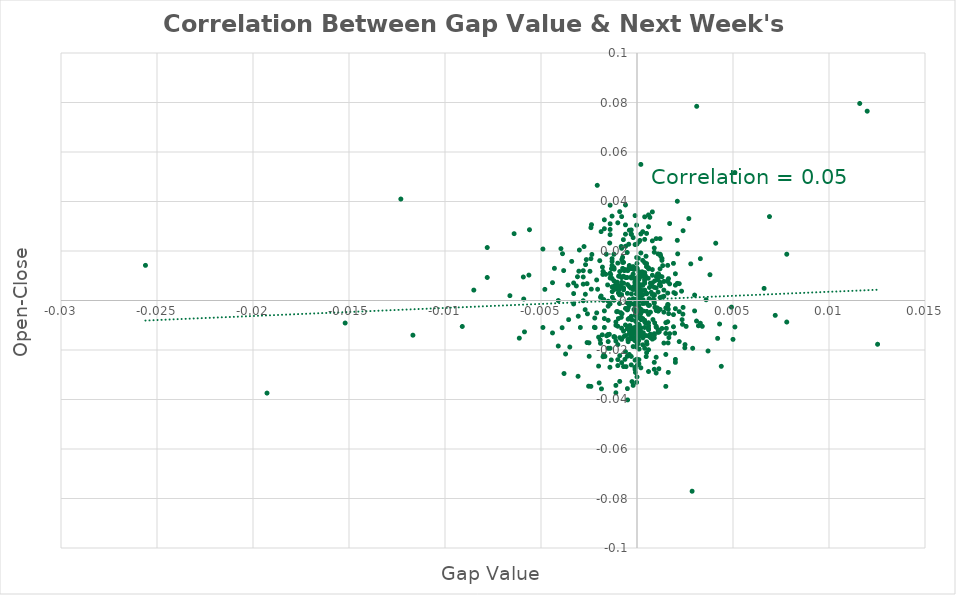
| Category | Series 0 |
|---|---|
| -0.000650000000000039 | 0.012 |
| 0.000739999999999962 | 0.006 |
| 0.000129999999999963 | 0.01 |
| -2.99999999999744e-05 | 0.003 |
| -0.000439999999999995 | -0.01 |
| -0.000589999999999868 | -0.014 |
| -0.00141999999999997 | 0.023 |
| -8.000000000008e-05 | 0 |
| -0.000879999999999991 | 0.002 |
| 0.000900000000000122 | -0.015 |
| 0.000789999999999846 | 0.002 |
| -0.0011899999999998 | 0.013 |
| -0.000460000000000127 | -0.008 |
| 0.00123000000000006 | 0.006 |
| 0.000210000000000043 | -0.008 |
| -0.000600000000000156 | 0.031 |
| -0.000199999999999978 | 0.004 |
| -0.000290000000000123 | 0.003 |
| 0.000140000000000029 | -0.004 |
| 0.000699999999999922 | -0.005 |
| 0.00150000000000005 | -0.009 |
| 1.00000000000655e-05 | -0.018 |
| -0.00101000000000017 | 0.006 |
| -0.000850000000000239 | -0.005 |
| 0.000220000000000109 | -0.013 |
| -0.000480000000000036 | 0.012 |
| -7.00000000000145e-05 | -0.004 |
| -0.00238000000000004 | 0.005 |
| 0.000129999999999963 | 0.006 |
| -0.00221999999999988 | -0.011 |
| 0.00119000000000002 | 0.01 |
| 0.00101000000000017 | 0.01 |
| -0.000390000000000112 | -0.015 |
| -0.00180999999999986 | -0.014 |
| 0.00104000000000015 | -0.003 |
| -9.99999999984346e-06 | -0.001 |
| 0.000920000000000031 | -0.009 |
| 0.000650000000000039 | -0.002 |
| -0.00051000000000001 | 0.009 |
| -0.000340000000000007 | -0.011 |
| -0.0116699999999998 | -0.014 |
| 0.0125299999999999 | -0.018 |
| -0.00235000000000007 | 0.019 |
| 0.00255999999999989 | -0.01 |
| 0.000390000000000112 | -0.001 |
| -0.00218000000000007 | -0.011 |
| 0.00102000000000002 | -0.004 |
| -0.0024900000000001 | -0.023 |
| 0.000299999999999967 | 0.01 |
| -0.00117000000000011 | -0.015 |
| -0.00177000000000004 | 0.012 |
| -0.00038999999999989 | -0.012 |
| 0.00162000000000017 | -0.017 |
| 0.00120999999999993 | 0.019 |
| -0.00143999999999988 | -0.014 |
| -0.00207000000000001 | 0.047 |
| -0.000489999999999879 | 0.006 |
| -0.000569999999999959 | -0.027 |
| 0.000319999999999875 | 0 |
| 0.000929999999999875 | -0.003 |
| -0.000909999999999966 | 0.002 |
| -7.99999999998579e-05 | -0.029 |
| -0.00133999999999989 | -0.024 |
| 0.00117000000000011 | 0.006 |
| -0.00116000000000005 | -0.015 |
| 0.000269999999999992 | -0.014 |
| 0.00016000000000016 | 0.002 |
| -0.00264000000000019 | 0.017 |
| 0.00134000000000011 | 0.014 |
| -0.00251999999999985 | -0.035 |
| 0.000520000000000076 | -0.018 |
| 0.0 | -0.006 |
| -1.99999999999089e-05 | 0.03 |
| -0.00103000000000008 | 0.007 |
| -0.000129999999999963 | -0.013 |
| -0.000310000000000032 | 0.013 |
| 0.00162999999999979 | -0.004 |
| -0.00372000000000016 | -0.022 |
| -0.00193999999999983 | 0.016 |
| 0.00286999999999992 | -0.077 |
| 0.0119899999999999 | 0.077 |
| 0.00310999999999994 | 0.078 |
| -0.00063000000000013 | -0.024 |
| -0.00133000000000005 | 0.013 |
| -0.00120000000000009 | 0.008 |
| 8.99999999999234e-05 | -0.016 |
| -0.00239999999999995 | 0.029 |
| 0.000329999999999941 | -0.013 |
| -0.000970000000000137 | -0.007 |
| -0.00269000000000008 | 0.003 |
| 8.000000000008e-05 | 0.002 |
| 0.00063000000000013 | 0.001 |
| -7.00000000000145e-05 | -0.008 |
| 0.000669999999999948 | 0.034 |
| 0.000110000000000054 | -0.02 |
| -0.00173 | -0.022 |
| 0.00234999999999985 | -0.008 |
| 0.00163999999999986 | 0.009 |
| 0.00153000000000003 | -0.011 |
| -0.000750000000000028 | 0.015 |
| -0.000509999999999788 | -0.011 |
| -0.00381999999999993 | 0.012 |
| -0.00185000000000012 | -0.036 |
| -0.00197000000000002 | -0.033 |
| 0.000329999999999941 | -0.004 |
| -0.000750000000000028 | 0.017 |
| -0.00128000000000017 | 0.001 |
| -0.00167000000000006 | -0.023 |
| -0.00157999999999991 | -0.014 |
| -0.00177999999999989 | 0.011 |
| 0.00116000000000005 | -0.013 |
| 0.00236999999999998 | -0.01 |
| -0.00174999999999991 | 0.011 |
| -0.00059000000000009 | 0.022 |
| -0.00137000000000009 | 0.01 |
| 0.0 | 0.008 |
| 9.00000000001455e-05 | -0.005 |
| 7.00000000000145e-05 | 0.017 |
| -0.00129000000000001 | 0.004 |
| -0.00046999999999997 | -0.016 |
| -0.000399999999999955 | 0.014 |
| 7.00000000000145e-05 | -0.011 |
| 0.00130000000000007 | 0.01 |
| 0.00129000000000001 | 0.001 |
| -0.000399999999999955 | 0.028 |
| -0.00267999999999979 | 0.014 |
| 1.99999999999089e-05 | -0.026 |
| 0.000920000000000031 | 0.008 |
| -7.00000000000145e-05 | 0.009 |
| -0.000159999999999938 | -0.004 |
| 0.000839999999999951 | 0 |
| 0.00046999999999997 | 0.018 |
| 0.00059000000000009 | 0.009 |
| -0.0030699999999999 | -0.031 |
| 0.00409999999999999 | 0.023 |
| 0.00195999999999996 | -0.013 |
| 0.00165999999999999 | -0.015 |
| -0.000329999999999941 | 0.005 |
| -0.000750000000000028 | 0.013 |
| -0.00162999999999979 | 0.011 |
| -2.0000000000131e-05 | -0.033 |
| 0.00161999999999995 | -0.002 |
| 1.00000000000655e-05 | -0.011 |
| -0.000460000000000127 | -0.003 |
| 0.00164999999999992 | -0.005 |
| 0.00158999999999998 | -0.003 |
| -0.00302999999999986 | 0.012 |
| 0.00192000000000014 | 0.003 |
| 0.00121999999999999 | 0.007 |
| 0.00231999999999987 | 0.004 |
| -0.00592000000000014 | 0.009 |
| 0.00661999999999984 | 0.005 |
| 6.0000000000171e-05 | -0.013 |
| 0.000149999999999872 | 0.024 |
| -0.00662000000000007 | 0.002 |
| 0.000189999999999912 | -0.003 |
| 0.000829999999999886 | -0.008 |
| -0.000950000000000006 | 0.004 |
| -0.000199999999999978 | -0.001 |
| 0.000310000000000032 | -0.015 |
| -0.00409999999999999 | 0 |
| -0.000240000000000018 | -0.011 |
| -0.000369999999999981 | -0.01 |
| -0.00173 | 0 |
| -0.00042999999999993 | 0.023 |
| 0.00107000000000012 | 0.011 |
| -0.00081999999999982 | 0.002 |
| -0.000959999999999849 | 0.01 |
| 0.00209999999999999 | 0.007 |
| -0.00294999999999978 | -0.011 |
| -0.00117999999999995 | 0.004 |
| -0.00175000000000014 | 0 |
| -0.000159999999999938 | 0.013 |
| -0.000820000000000042 | -0.007 |
| 0.002 | -0.003 |
| -0.000790000000000068 | 0.017 |
| 2.99999999999744e-05 | 0.007 |
| 0.000890000000000057 | -0.001 |
| -0.000709999999999988 | 0.025 |
| -0.000820000000000042 | 0.022 |
| 9.99999999999889e-05 | 0.024 |
| -0.000450000000000061 | -0.016 |
| 3.99999999998179e-05 | -0.007 |
| 0.000269999999999992 | 0.012 |
| -2.99999999999744e-05 | -0.019 |
| 0.000450000000000061 | -0.009 |
| -0.000780000000000002 | -0.005 |
| 0.00212000000000012 | 0.019 |
| -0.0020500000000001 | 0.005 |
| -0.00177000000000004 | -0.023 |
| -0.00187000000000026 | 0.028 |
| -0.00186999999999981 | 0.002 |
| 0.00439000000000011 | -0.027 |
| 0.000179999999999846 | -0.012 |
| -0.000459999999999904 | -0.017 |
| -0.00106000000000006 | -0.005 |
| -0.000179999999999846 | 0.005 |
| -0.00358999999999998 | 0.006 |
| -0.00191999999999992 | -0.016 |
| -4.000000000004e-05 | -0.012 |
| -0.00258000000000002 | -0.005 |
| -0.000360000000000138 | -0.012 |
| 0.000650000000000039 | 0.005 |
| -4.000000000004e-05 | 0.006 |
| 0.00112000000000001 | 0.011 |
| 0.00248999999999988 | -0.019 |
| -0.00236999999999998 | 0.031 |
| -0.000579999999999802 | 0.009 |
| -0.00279999999999991 | 0.007 |
| -0.000490000000000101 | -0.04 |
| 0.000999999999999889 | -0.023 |
| 0.00491999999999981 | -0.003 |
| -0.000909999999999966 | -0.001 |
| -0.00042999999999993 | 0.013 |
| 0.000740000000000185 | 0.003 |
| -0.000299999999999967 | 0.01 |
| -0.000669999999999948 | -0.015 |
| -0.000910000000000188 | 0.01 |
| -0.00051000000000001 | -0.023 |
| -0.00245000000000006 | 0.012 |
| 0.00163000000000002 | -0.029 |
| -0.000999999999999889 | 0.005 |
| -0.00306000000000006 | -0.006 |
| -0.00279999999999991 | 0.012 |
| -5.99999999999489e-05 | -0.008 |
| -0.0038800000000001 | 0.019 |
| -0.000110000000000054 | -0.015 |
| 0.000439999999999995 | 0.01 |
| -0.00100999999999995 | -0.004 |
| 0.00340000000000007 | -0.01 |
| 0.00114000000000014 | -0.028 |
| 0.00046999999999997 | -0.014 |
| -1.99999999999089e-05 | 0.017 |
| 0.00239000000000011 | -0.006 |
| -0.000269999999999992 | -0.008 |
| 0.000480000000000036 | -0.023 |
| -0.000629999999999908 | 0.013 |
| 0.00123000000000006 | 0.018 |
| 0.000189999999999912 | -0.005 |
| -0.00153000000000003 | 0.006 |
| -0.000390000000000112 | -0.001 |
| 0.00380000000000002 | 0.01 |
| 5.99999999999489e-05 | -0.017 |
| -0.0192699999999999 | -0.037 |
| -0.00316000000000005 | 0.006 |
| -0.000839999999999951 | 0.006 |
| -0.00586000000000019 | -0.013 |
| -0.00051000000000001 | 0.019 |
| -9.00000000001455e-05 | 0.009 |
| -0.00563000000000002 | 0.01 |
| -0.00140999999999991 | -0.027 |
| -0.00151000000000012 | -0.014 |
| -0.00395999999999996 | 0.021 |
| -0.00612999999999996 | -0.015 |
| -0.000260000000000149 | -0.033 |
| -0.000969999999999915 | 0.003 |
| -0.00356 | -0.008 |
| -0.00275999999999987 | 0.022 |
| 0.000199999999999978 | 0.055 |
| 0.000299999999999967 | -0.001 |
| 0.000399999999999955 | 0.004 |
| -0.000299999999999967 | 0.027 |
| 0.000499999999999944 | 0.003 |
| -9.99999999999889e-05 | -0.016 |
| -0.00169999999999981 | -0.007 |
| 0.000699999999999922 | -0.015 |
| 0.00130000000000007 | 0.016 |
| 0.00129999999999985 | 0.017 |
| 0.0031000000000001 | -0.008 |
| 0.00109999999999987 | 0.008 |
| -0.000999999999999889 | -0.024 |
| -0.00139999999999984 | 0.031 |
| -0.0255999999999998 | 0.014 |
| 0.0116 | 0.08 |
| 0.000600000000000156 | -0.009 |
| -0.0048999999999999 | 0.021 |
| -0.000799999999999911 | 0.009 |
| 0.000600000000000156 | -0.011 |
| -0.0008999999999999 | -0.015 |
| -0.00120000000000009 | 0.006 |
| -0.00130000000000007 | 0.017 |
| 0.00499999999999989 | -0.016 |
| -0.000599999999999933 | -0.021 |
| -0.0011000000000001 | -0.009 |
| -0.000800000000000133 | 0.009 |
| -0.00100000000000011 | -0.01 |
| -0.00170000000000003 | 0.033 |
| -0.000600000000000156 | -0.01 |
| -0.00150000000000005 | -0.017 |
| -0.00109999999999987 | -0.037 |
| -0.0122999999999999 | 0.041 |
| -0.00130000000000007 | 0.009 |
| -0.000499999999999944 | -0.001 |
| 0.000100000000000211 | -0.026 |
| 0.000199999999999978 | 0.002 |
| -9.99999999999889e-05 | -0.001 |
| 0.000499999999999944 | 0.027 |
| -0.00780000000000002 | 0.021 |
| -0.0031000000000001 | 0.01 |
| 0.000499999999999944 | -0.004 |
| 0.000399999999999955 | 0.034 |
| 9.99999999997669e-05 | -0.012 |
| 0.000299999999999744 | -0.007 |
| -0.000999999999999889 | 0.015 |
| 0.000100000000000211 | 0.004 |
| 0.000299999999999744 | -0.018 |
| 0.00209999999999999 | 0.04 |
| -0.000700000000000145 | -0.012 |
| 0.000599999999999933 | 0.013 |
| -0.000399999999999955 | -0.012 |
| 0.00109999999999987 | -0.013 |
| 0.00120000000000009 | 0.001 |
| -0.000800000000000133 | 0.034 |
| 9.99999999999889e-05 | -0.01 |
| 0.0008999999999999 | -0.025 |
| 0.00209999999999999 | 0.024 |
| -0.00139999999999984 | 0.029 |
| 0.00119999999999986 | -0.004 |
| -0.000300000000000189 | -0.015 |
| 0.00159999999999982 | 0.014 |
| -0.000100000000000211 | -0.011 |
| 0.000799999999999911 | 0.01 |
| -0.00170000000000003 | -0.011 |
| -0.00330000000000008 | 0.003 |
| -0.00429999999999997 | 0.013 |
| -0.000100000000000211 | 0.013 |
| -0.000900000000000122 | -0.033 |
| 0.000599999999999933 | -0.029 |
| 0.000499999999999722 | 0.003 |
| -0.00119999999999986 | 0.019 |
| 0.00119999999999986 | 0.025 |
| 0.0008999999999999 | -0.028 |
| 0.00100000000000011 | -0.029 |
| -0.000699999999999922 | 0.004 |
| -0.000299999999999967 | -0.023 |
| -0.0011000000000001 | -0.034 |
| -0.000299999999999967 | 0.028 |
| 0.00150000000000005 | -0.003 |
| 0.0011000000000001 | 0.009 |
| -0.000399999999999955 | -0.022 |
| 0.000599999999999933 | 0.03 |
| -0.00139999999999984 | 0.038 |
| -0.000500000000000167 | -0.004 |
| 0.00299999999999989 | 0.002 |
| -0.00249999999999994 | -0.017 |
| 0.00419999999999998 | -0.015 |
| 0.00139999999999984 | -0.005 |
| -0.00130000000000007 | 0.014 |
| 0.00200000000000022 | 0.003 |
| -0.00780000000000002 | 0.009 |
| 0.000800000000000133 | 0.024 |
| 0.000399999999999955 | 0.007 |
| 0.000199999999999978 | 0.01 |
| -0.00120000000000009 | -0.015 |
| -0.000999999999999889 | 0.006 |
| -0.00139999999999984 | -0.001 |
| 0.00160000000000004 | 0.003 |
| 0.000900000000000122 | 0.021 |
| -0.00280000000000013 | 0.01 |
| -0.000199999999999978 | 0.009 |
| 0.00140000000000006 | 0.002 |
| -0.000399999999999955 | -0.002 |
| 0.000199999999999978 | -0.011 |
| -0.00139999999999984 | 0.027 |
| 0.00200000000000022 | 0.006 |
| 0.0008999999999999 | -0.001 |
| -0.0152000000000001 | -0.009 |
| -0.000299999999999967 | 0.027 |
| -0.00170000000000003 | -0.004 |
| 0.00280000000000013 | 0.015 |
| 0.000399999999999955 | 0.009 |
| 0.0 | 0.005 |
| 0.000399999999999955 | 0.015 |
| 0.000399999999999955 | 0.011 |
| 0.0 | 0.004 |
| 0.000399999999999955 | 0.004 |
| -0.000199999999999978 | -0.013 |
| 9.99999999999889e-05 | -0.002 |
| 0.00100000000000011 | -0.004 |
| 0.000799999999999911 | -0.016 |
| 0.0011000000000001 | -0.003 |
| 0.000399999999999955 | 0.008 |
| -9.99999999999889e-05 | -0.002 |
| -0.000499999999999722 | 0.003 |
| 0.00109999999999987 | 0.003 |
| 0.000199999999999978 | -0.007 |
| 0.000499999999999944 | -0.001 |
| -9.99999999999889e-05 | -0.006 |
| -0.000199999999999978 | -0.016 |
| 0.00140000000000006 | 0.008 |
| -0.0011000000000001 | -0.016 |
| -0.0006999999999997 | 0.015 |
| 0.000399999999999955 | 0.007 |
| -0.00279999999999991 | 0 |
| 0.00130000000000007 | -0.011 |
| 0.00190000000000001 | 0.015 |
| -0.000199999999999978 | -0.034 |
| -0.000799999999999911 | 0.002 |
| 0.0022000000000002 | 0.007 |
| -0.000299999999999744 | -0.006 |
| -0.000399999999999955 | 0.006 |
| -0.00150000000000005 | -0.008 |
| 0.000199999999999978 | 0.006 |
| 0.000700000000000145 | -0.014 |
| -0.000499999999999944 | -0.004 |
| -0.000199999999999978 | 0.005 |
| 0.000299999999999967 | 0.002 |
| 0.0 | -0.014 |
| 0.000599999999999933 | -0.01 |
| -0.000800000000000133 | -0.011 |
| 0.000400000000000178 | -0.009 |
| 0.00100000000000011 | 0.025 |
| 0.000199999999999978 | 0.001 |
| 0.00290000000000012 | -0.019 |
| 0.00160000000000004 | 0.008 |
| 0.000499999999999722 | 0.014 |
| 0.0 | -0.013 |
| 0.00719999999999987 | -0.006 |
| -0.000799999999999911 | -0.025 |
| 0.00429999999999974 | -0.01 |
| -9.99999999999889e-05 | 0.008 |
| -0.0008999999999999 | 0.005 |
| -0.000199999999999978 | -0.013 |
| 0.000499999999999944 | -0.021 |
| 0.000400000000000178 | 0.01 |
| 0.00190000000000001 | -0.011 |
| 0.00170000000000003 | -0.013 |
| -0.0008999999999999 | -0.022 |
| -0.000999999999999889 | 0.031 |
| -0.00239999999999995 | 0.017 |
| 0.00170000000000003 | 0.031 |
| -0.00410000000000021 | -0.018 |
| 0.00150000000000005 | -0.035 |
| 0.00190000000000001 | -0.006 |
| 0.00170000000000003 | 0.007 |
| 0.0011000000000001 | 0.019 |
| -9.99999999999889e-05 | 0.023 |
| 0.00160000000000004 | -0.009 |
| 9.99999999997669e-05 | -0.024 |
| 9.99999999999889e-05 | 0.012 |
| -0.00269999999999992 | -0.004 |
| 9.99999999999889e-05 | -0.015 |
| 0.000199999999999978 | 0.004 |
| 0.000999999999999889 | -0.011 |
| 0.000399999999999955 | -0.019 |
| 0.000600000000000156 | 0.013 |
| -0.00849999999999995 | 0.004 |
| -0.00130000000000007 | 0.034 |
| 0.000300000000000189 | 0.028 |
| 9.99999999999889e-05 | -0.01 |
| -0.00329999999999985 | 0.007 |
| -0.00130000000000007 | 0.006 |
| 0.000199999999999978 | 0.027 |
| 0.000599999999999933 | -0.006 |
| 0.002 | 0.011 |
| -0.00150000000000005 | 0 |
| -0.000399999999999955 | 0 |
| 9.99999999997669e-05 | -0.014 |
| 0.000599999999999933 | -0.002 |
| 0.0008999999999999 | 0.002 |
| 0.000699999999999922 | -0.014 |
| 0.000899999999999678 | 0.002 |
| -0.000900000000000122 | 0.012 |
| 9.99999999999889e-05 | 0.008 |
| 0.0 | -0.01 |
| 0.000799999999999911 | 0.007 |
| -9.99999999999889e-05 | 0.007 |
| -0.00190000000000001 | 0.001 |
| 0.000699999999999922 | 0.007 |
| 0.000499999999999722 | -0.001 |
| 0.000599999999999933 | -0.02 |
| 0.00149999999999983 | -0.013 |
| 0.0011000000000001 | -0.004 |
| 0.00100000000000011 | -0.01 |
| -0.00150000000000005 | -0.002 |
| -0.00219999999999975 | -0.007 |
| -0.000699999999999922 | 0.01 |
| 0.000600000000000156 | -0.012 |
| 0.000199999999999978 | -0.004 |
| -0.00109999999999987 | -0.01 |
| -0.000800000000000133 | 0.021 |
| -0.00150000000000005 | -0.014 |
| -0.000699999999999922 | 0.012 |
| 0.00370000000000003 | -0.02 |
| -9.99999999999889e-05 | -0.011 |
| 0.00270000000000014 | 0.033 |
| -0.00120000000000009 | 0.013 |
| -0.000199999999999978 | 0.025 |
| -0.00109999999999987 | 0.007 |
| 0.000799999999999911 | 0.012 |
| 0.000299999999999744 | -0.014 |
| 0.000199999999999978 | -0.027 |
| 0.00139999999999984 | 0.004 |
| 0.000500000000000167 | 0.015 |
| 0.000599999999999933 | -0.014 |
| -0.000599999999999933 | -0.003 |
| -0.000999999999999889 | -0.018 |
| 0.000299999999999744 | 0.016 |
| 0.00100000000000011 | 0.005 |
| 0.00239999999999995 | -0.003 |
| 0.00219999999999975 | -0.005 |
| -0.000699999999999922 | 0.005 |
| 0.000400000000000178 | -0.008 |
| -0.00190000000000001 | -0.017 |
| -0.00380000000000002 | -0.029 |
| -0.000199999999999978 | 0.011 |
| -0.00439999999999995 | 0.007 |
| 0.000900000000000122 | 0.005 |
| -9.99999999999889e-05 | -0.004 |
| -0.00139999999999984 | 0.011 |
| 0.00300000000000011 | -0.004 |
| 0.0051000000000001 | -0.011 |
| -0.0008999999999999 | 0.036 |
| 0.00239999999999995 | 0.028 |
| 0.00360000000000004 | 0 |
| -0.000300000000000189 | 0.009 |
| -0.00150000000000005 | -0.019 |
| 0.00109999999999987 | -0.012 |
| -0.000300000000000189 | -0.026 |
| -0.00330000000000008 | -0.001 |
| 0.00319999999999987 | -0.01 |
| -0.00559999999999982 | 0.029 |
| -0.00479999999999991 | 0.004 |
| -0.00639999999999996 | 0.027 |
| -0.00180000000000002 | 0.014 |
| 0.000299999999999744 | 0.01 |
| -0.000199999999999978 | -0.019 |
| 0.0077999999999998 | 0.019 |
| 0.000199999999999978 | 0.004 |
| 0.00330000000000008 | -0.009 |
| -0.00350000000000005 | -0.019 |
| -0.00439999999999995 | -0.013 |
| -0.00119999999999986 | 0 |
| 0.000399999999999955 | -0.011 |
| -0.00299999999999989 | 0.02 |
| 0.000199999999999978 | 0.003 |
| -0.00159999999999982 | 0.019 |
| -0.000800000000000133 | 0.007 |
| -0.000100000000000211 | -0.028 |
| 0.00160000000000004 | -0.002 |
| -0.00130000000000007 | 0.016 |
| 0.000600000000000156 | 0.035 |
| 0.00249999999999994 | -0.018 |
| -0.00140000000000006 | -0.019 |
| -0.000700000000000145 | 0.005 |
| -9.99999999999889e-05 | -0.027 |
| -0.00389999999999979 | -0.011 |
| 0.000199999999999978 | 0.019 |
| 0.0008999999999999 | -0.014 |
| 0.0008999999999999 | 0.019 |
| -0.000799999999999911 | -0.016 |
| 0.000499999999999944 | 0.014 |
| -0.002 | -0.026 |
| -0.00140000000000006 | 0.009 |
| -0.00100000000000011 | -0.026 |
| -0.000199999999999978 | 0.014 |
| -0.000399999999999955 | -0.013 |
| -0.00240000000000018 | -0.035 |
| -0.00590000000000001 | 0.001 |
| 0.00140000000000006 | -0.017 |
| -0.00209999999999999 | 0.008 |
| -0.000599999999999933 | 0.027 |
| 9.99999999997669e-05 | -0.004 |
| 0.000499999999999944 | -0.017 |
| -0.000599999999999933 | 0.039 |
| 0.00330000000000008 | 0.017 |
| 0.00160000000000004 | 0.008 |
| 0.000900000000000122 | -0.013 |
| -0.000500000000000167 | -0.036 |
| -0.00170000000000003 | 0.029 |
| -0.00209999999999999 | -0.005 |
| -0.00259999999999971 | -0.017 |
| 0.000100000000000211 | 0 |
| 0.00219999999999998 | -0.017 |
| -0.000100000000000211 | -0.027 |
| -0.00259999999999993 | 0.007 |
| -0.000699999999999922 | 0.007 |
| -0.000399999999999955 | 0 |
| 0.000299999999999744 | 0.006 |
| 0.000800000000000133 | 0.036 |
| 0.002 | -0.024 |
| -0.000699999999999922 | -0.027 |
| -0.00199999999999978 | -0.015 |
| 0.00150000000000005 | -0.022 |
| 0.0 | 0.013 |
| -0.000299999999999967 | -0.014 |
| 0.0 | -0.024 |
| 0.002 | -0.025 |
| 9.99999999999889e-05 | -0.01 |
| 9.99999999999889e-05 | 0 |
| 0.0 | 0 |
| -9.99999999999889e-05 | 0.007 |
| 0.00690000000000012 | 0.034 |
| 0.0051000000000001 | 0.052 |
| 0.000399999999999955 | 0.011 |
| -0.0091000000000001 | -0.011 |
| -0.0002000000000002 | 0.001 |
| 0.00780000000000002 | -0.009 |
| 0.0 | -0.031 |
| 0.00119999999999986 | 0.013 |
| -0.00339999999999984 | 0.016 |
| -0.000399999999999955 | -0.007 |
| 0.0 | 0.009 |
| 0.000399999999999955 | 0.025 |
| 0.0 | 0.023 |
| -0.00490000000000012 | -0.011 |
| -9.99999999997669e-05 | 0.034 |
| 0.0 | 0.013 |
| 0.0 | 0.015 |
| -9.99999999997669e-05 | -0.024 |